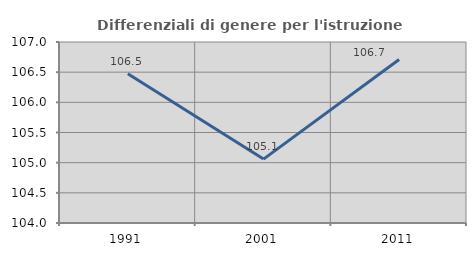
| Category | Differenziali di genere per l'istruzione superiore |
|---|---|
| 1991.0 | 106.475 |
| 2001.0 | 105.059 |
| 2011.0 | 106.71 |